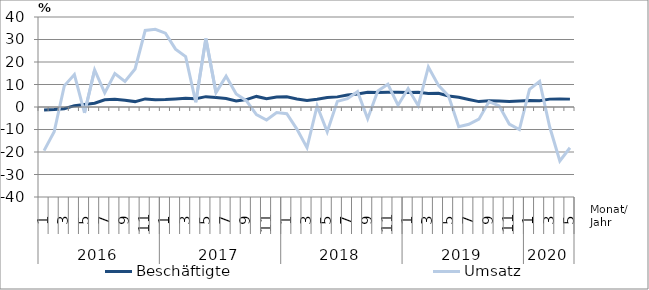
| Category | Beschäftigte | Umsatz |
|---|---|---|
| 0 | -1.3 | -19.4 |
| 1 | -1.1 | -11 |
| 2 | -0.8 | 9.4 |
| 3 | 0.6 | 14.4 |
| 4 | 1.1 | -2.6 |
| 5 | 1.7 | 16.5 |
| 6 | 3.2 | 6.3 |
| 7 | 3.4 | 14.9 |
| 8 | 3 | 11.4 |
| 9 | 2.4 | 16.9 |
| 10 | 3.6 | 34 |
| 11 | 3.2 | 34.5 |
| 12 | 3.3 | 32.8 |
| 13 | 3.6 | 25.7 |
| 14 | 3.9 | 22.4 |
| 15 | 3.7 | 2.1 |
| 16 | 4.6 | 30.4 |
| 17 | 4.2 | 6.4 |
| 18 | 3.8 | 13.7 |
| 19 | 2.7 | 5.8 |
| 20 | 3.3 | 2.8 |
| 21 | 4.7 | -3.4 |
| 22 | 3.7 | -5.8 |
| 23 | 4.4 | -2.5 |
| 24 | 4.5 | -3 |
| 25 | 3.6 | -9.8 |
| 26 | 2.9 | -18.1 |
| 27 | 3.4 | 0.5 |
| 28 | 4.2 | -11 |
| 29 | 4.5 | 2.5 |
| 30 | 5.3 | 3.7 |
| 31 | 5.8 | 6.8 |
| 32 | 6.6 | -5.2 |
| 33 | 6.5 | 7.1 |
| 34 | 6.6 | 10.1 |
| 35 | 6.6 | 0.8 |
| 36 | 6.4 | 8.2 |
| 37 | 6.5 | 0.6 |
| 38 | 6 | 17.8 |
| 39 | 6.1 | 9.6 |
| 40 | 4.9 | 4.9 |
| 41 | 4.3 | -8.8 |
| 42 | 3.3 | -7.7 |
| 43 | 2.4 | -5.4 |
| 44 | 2.8 | 2.4 |
| 45 | 2.7 | 0.5 |
| 46 | 2.5 | -7.6 |
| 47 | 2.7 | -10 |
| 48 | 2.9 | 7.8 |
| 49 | 2.8 | 11.4 |
| 50 | 3.5 | -8.9 |
| 51 | 3.6 | -24 |
| 52 | 3.5 | -18.1 |